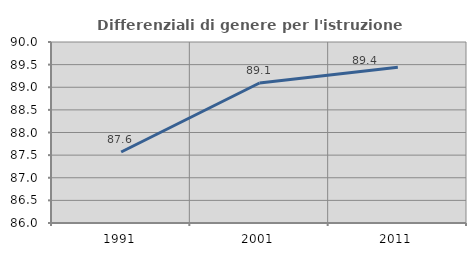
| Category | Differenziali di genere per l'istruzione superiore |
|---|---|
| 1991.0 | 87.569 |
| 2001.0 | 89.093 |
| 2011.0 | 89.443 |